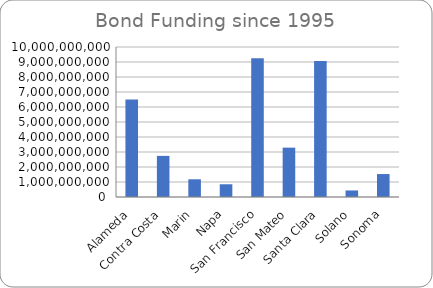
| Category | Series 0 |
|---|---|
| Alameda | 6507860069.24 |
| Contra Costa | 2740990928.36 |
| Marin | 1180790667 |
| Napa | 849018777 |
| San Francisco | 9251260307 |
| San Mateo | 3289813990 |
| Santa Clara | 9070736008 |
| Solano | 436118021 |
| Sonoma | 1529142359 |